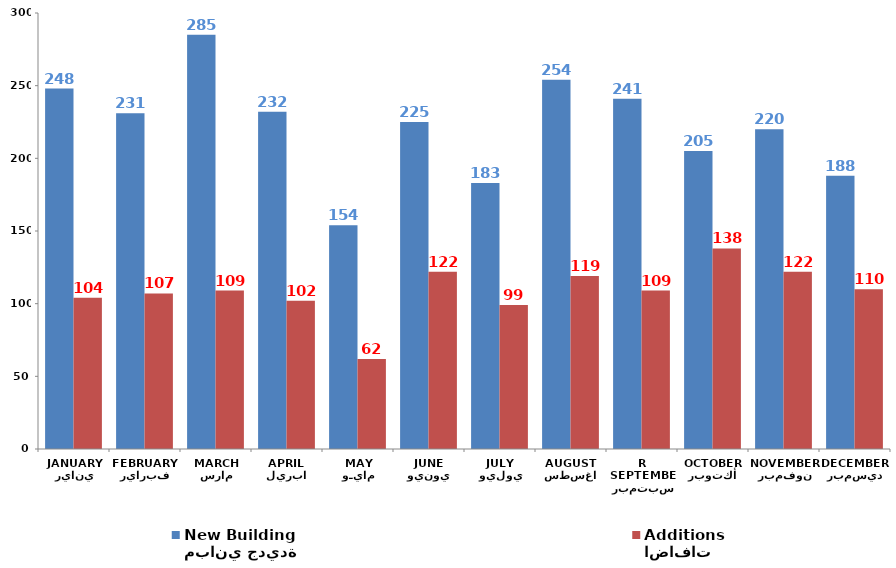
| Category | مباني جديدة
New Building | اضافات
Additions |
|---|---|---|
| يناير
JANUARY | 248 | 104 |
| فبراير
FEBRUARY | 231 | 107 |
| مارس
MARCH | 285 | 109 |
| ابريل
APRIL | 232 | 102 |
| مايـو
MAY
 | 154 | 62 |
| يونيو
JUNE | 225 | 122 |
| يوليو
JULY | 183 | 99 |
| اغسطس
AUGUST | 254 | 119 |
| سبتمبر
SEPTEMBER | 241 | 109 |
| أكتوبر
OCTOBER | 205 | 138 |
| نوفمبر
NOVEMBER | 220 | 122 |
| ديسمبر
DECEMBER | 188 | 110 |